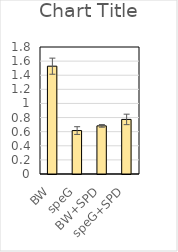
| Category | Series 0 |
|---|---|
| BW | 1.528 |
| speG | 0.616 |
| BW+SPD | 0.682 |
| speG+SPD | 0.774 |